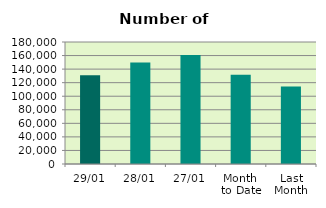
| Category | Series 0 |
|---|---|
| 29/01 | 130798 |
| 28/01 | 149724 |
| 27/01 | 160904 |
| Month 
to Date | 131758.9 |
| Last
Month | 114459.3 |